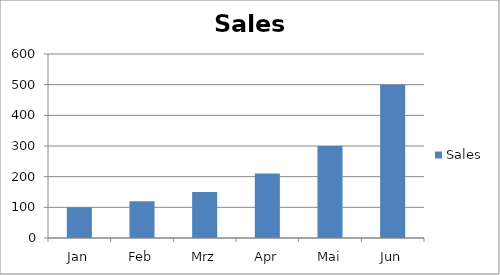
| Category | Sales |
|---|---|
| Jan | 100 |
| Feb | 120 |
| Mrz | 150 |
| Apr | 210 |
| Mai | 300 |
| Jun | 500 |